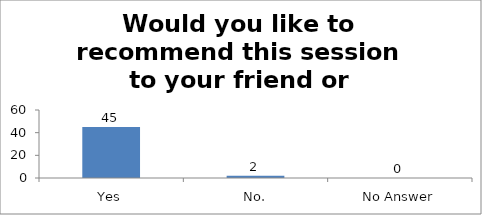
| Category | Would you like to recommend this session to your friend or colleague? |
|---|---|
| Yes | 45 |
| No. | 2 |
| No Answer | 0 |